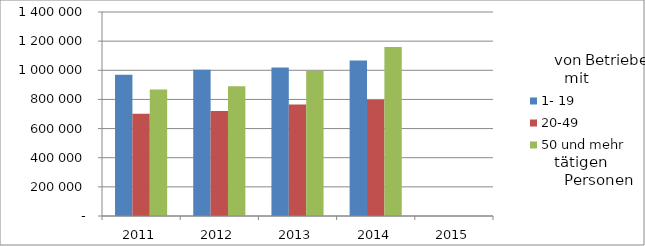
| Category | 1- 19 | 20-49 | 50 und mehr |
|---|---|---|---|
| 2011.0 | 968885.192 | 701104.228 | 868846.213 |
| 2012.0 | 1004481.951 | 720973.916 | 889638.846 |
| 2013.0 | 1018644.471 | 765877.932 | 997407.657 |
| 2014.0 | 1067719.672 | 796122.546 | 1160478.917 |
| 2015.0 | 0 | 0 | 0 |